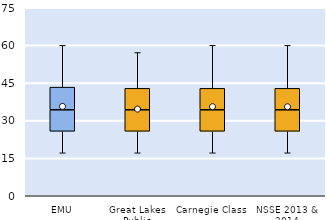
| Category | 25th | 50th | 75th |
|---|---|---|---|
| EMU | 25.714 | 8.571 | 9.048 |
| Great Lakes Public | 25.714 | 8.571 | 8.571 |
| Carnegie Class | 25.714 | 8.571 | 8.571 |
| NSSE 2013 & 2014 | 25.714 | 8.571 | 8.571 |